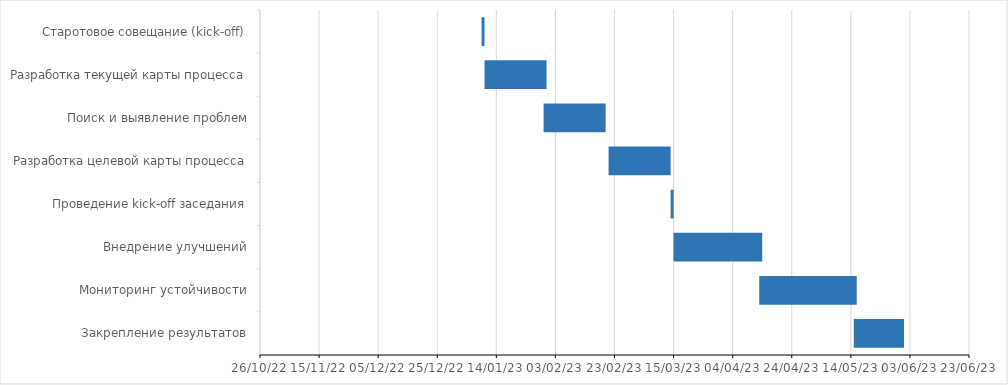
| Category | 09.01.2023 | Длительность |
|---|---|---|
| Старотовое совещание (kick-off) | 1/9/23 | 1 |
| Разработка текущей карты процесса | 1/10/23 | 21 |
| Поиск и выявление проблем | 1/30/23 | 21 |
| Разработка целевой карты процесса | 2/21/23 | 21 |
| Проведение kick-off заседания | 3/14/23 | 1 |
| Внедрение улучшений | 3/15/23 | 30 |
| Мониторинг устойчивости | 4/13/23 | 33 |
| Закрепление результатов | 5/15/23 | 17 |